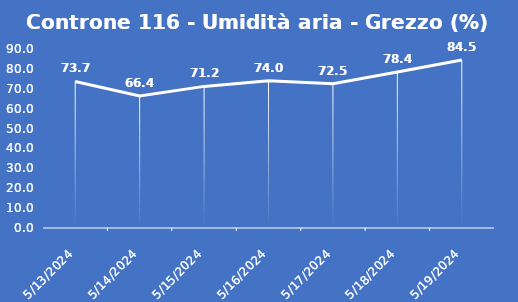
| Category | Controne 116 - Umidità aria - Grezzo (%) |
|---|---|
| 5/13/24 | 73.7 |
| 5/14/24 | 66.4 |
| 5/15/24 | 71.2 |
| 5/16/24 | 74 |
| 5/17/24 | 72.5 |
| 5/18/24 | 78.4 |
| 5/19/24 | 84.5 |